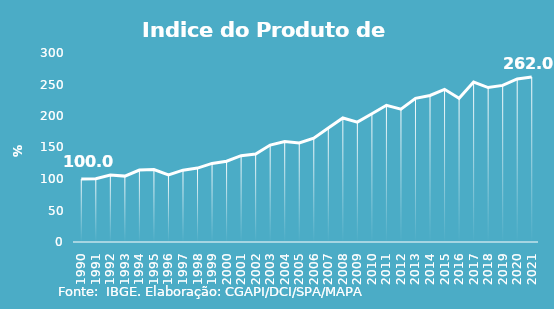
| Category | Indice de Prod. base 1990 |
|---|---|
| 1990.0 | 100 |
| 1991.0 | 100.275 |
| 1992.0 | 106.203 |
| 1993.0 | 104.57 |
| 1994.0 | 114.164 |
| 1995.0 | 115.024 |
| 1996.0 | 106.552 |
| 1997.0 | 114.037 |
| 1998.0 | 117.319 |
| 1999.0 | 124.734 |
| 2000.0 | 128.293 |
| 2001.0 | 136.975 |
| 2002.0 | 139.51 |
| 2003.0 | 153.868 |
| 2004.0 | 159.641 |
| 2005.0 | 157.136 |
| 2006.0 | 164.858 |
| 2007.0 | 180.781 |
| 2008.0 | 196.91 |
| 2009.0 | 190.309 |
| 2010.0 | 203.581 |
| 2011.0 | 217.041 |
| 2012.0 | 210.932 |
| 2013.0 | 228.009 |
| 2014.0 | 232.562 |
| 2015.0 | 242.318 |
| 2016.0 | 228.239 |
| 2017.0 | 253.826 |
| 2018.0 | 245.134 |
| 2019.0 | 248.619 |
| 2020.0 | 258.848 |
| 2021.0 | 262.048 |